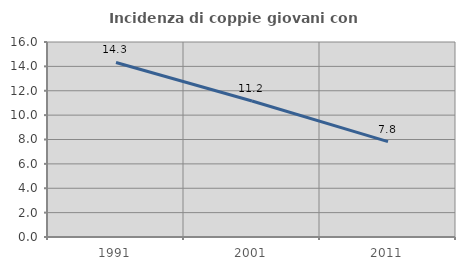
| Category | Incidenza di coppie giovani con figli |
|---|---|
| 1991.0 | 14.322 |
| 2001.0 | 11.161 |
| 2011.0 | 7.829 |